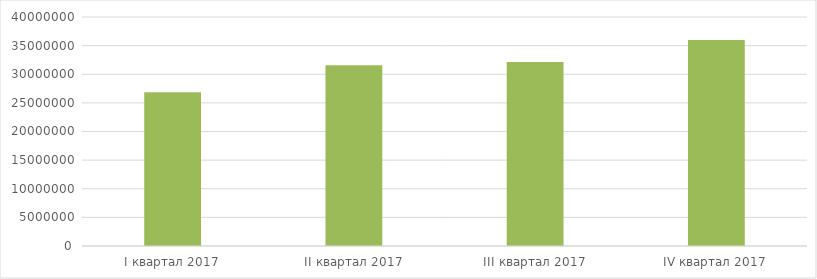
| Category | Бухгалтерская прибыль |
|---|---|
| I квартал 2017 | 26847210 |
| II квартал 2017 | 31555350 |
| III квартал 2017 | 32130000 |
| IV квартал 2017 | 35967000 |